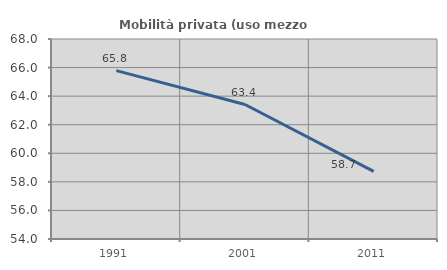
| Category | Mobilità privata (uso mezzo privato) |
|---|---|
| 1991.0 | 65.789 |
| 2001.0 | 63.415 |
| 2011.0 | 58.73 |